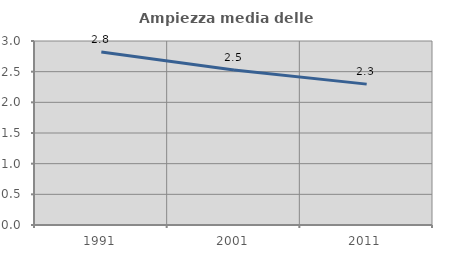
| Category | Ampiezza media delle famiglie |
|---|---|
| 1991.0 | 2.82 |
| 2001.0 | 2.528 |
| 2011.0 | 2.297 |